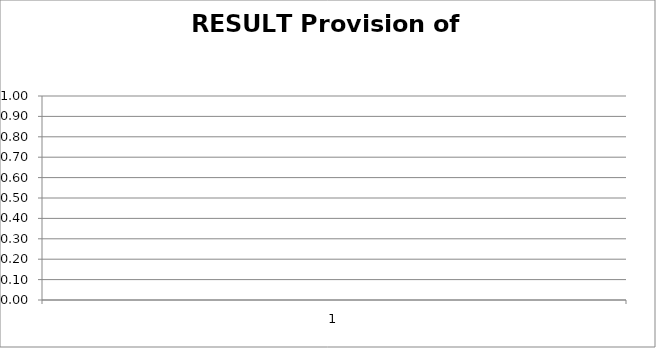
| Category | RESULT Provision of Services  |
|---|---|
| 0 | 0 |